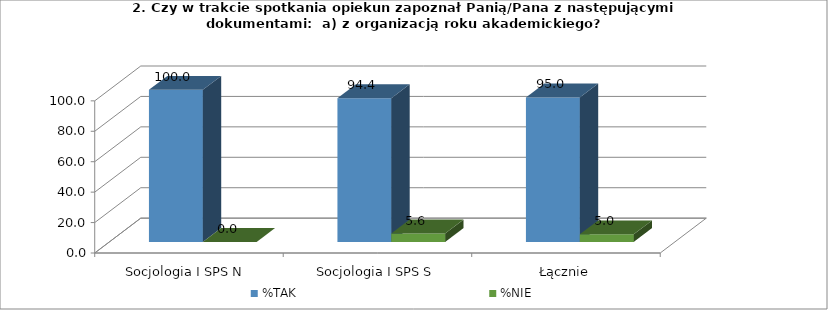
| Category | %TAK | %NIE |
|---|---|---|
| Socjologia I SPS N  | 100 | 0 |
| Socjologia I SPS S | 94.444 | 5.556 |
| Łącznie | 95 | 5 |